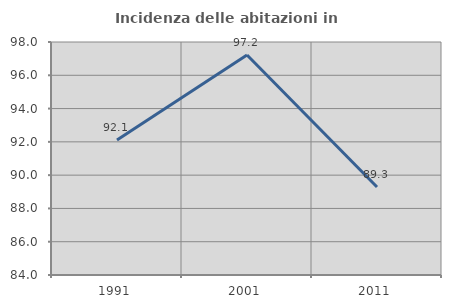
| Category | Incidenza delle abitazioni in proprietà  |
|---|---|
| 1991.0 | 92.105 |
| 2001.0 | 97.222 |
| 2011.0 | 89.286 |